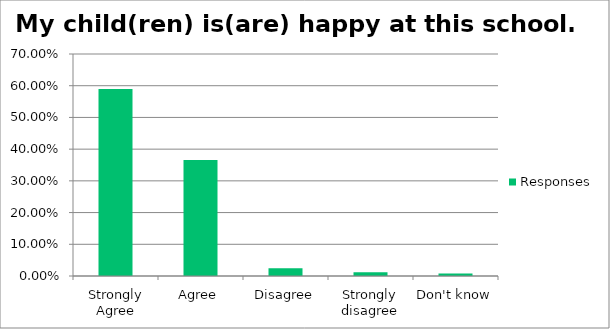
| Category | Responses |
|---|---|
| Strongly Agree | 0.589 |
| Agree | 0.366 |
| Disagree | 0.024 |
| Strongly disagree | 0.012 |
| Don't know | 0.008 |